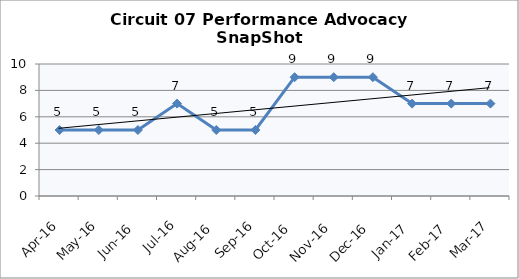
| Category | Circuit 07 |
|---|---|
| Apr-16 | 5 |
| May-16 | 5 |
| Jun-16 | 5 |
| Jul-16 | 7 |
| Aug-16 | 5 |
| Sep-16 | 5 |
| Oct-16 | 9 |
| Nov-16 | 9 |
| Dec-16 | 9 |
| Jan-17 | 7 |
| Feb-17 | 7 |
| Mar-17 | 7 |